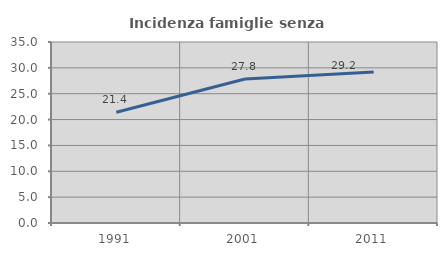
| Category | Incidenza famiglie senza nuclei |
|---|---|
| 1991.0 | 21.429 |
| 2001.0 | 27.842 |
| 2011.0 | 29.196 |